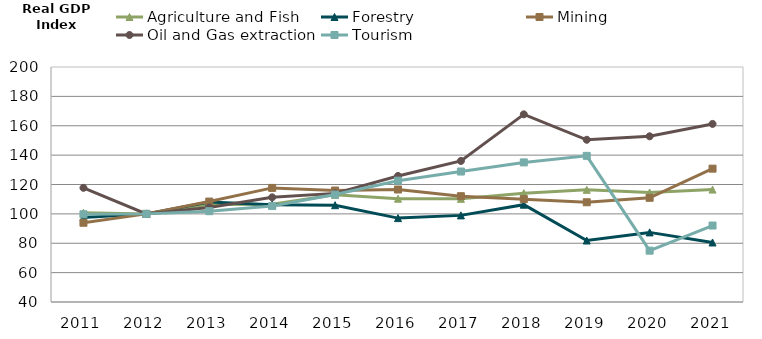
| Category | Agriculture and Fish | Forestry | Mining | Oil and Gas extraction | Tourism |
|---|---|---|---|---|---|
| 2011.0 | 100.799 | 97.506 | 93.951 | 117.728 | 99.708 |
| 2012.0 | 100 | 100 | 100 | 100 | 100 |
| 2013.0 | 106.332 | 108.091 | 108.374 | 104.383 | 101.836 |
| 2014.0 | 106.517 | 106.295 | 117.683 | 111.268 | 105.329 |
| 2015.0 | 112.945 | 105.908 | 115.892 | 113.953 | 113.15 |
| 2016.0 | 110.346 | 97.124 | 116.592 | 125.822 | 122.608 |
| 2017.0 | 110.228 | 98.979 | 112.022 | 136.036 | 128.826 |
| 2018.0 | 114.1 | 106.258 | 110.014 | 167.764 | 135.042 |
| 2019.0 | 116.378 | 81.872 | 107.902 | 150.457 | 139.521 |
| 2020.0 | 114.578 | 87.393 | 110.955 | 152.822 | 74.959 |
| 2021.0 | 116.524 | 80.523 | 130.792 | 161.239 | 92.054 |